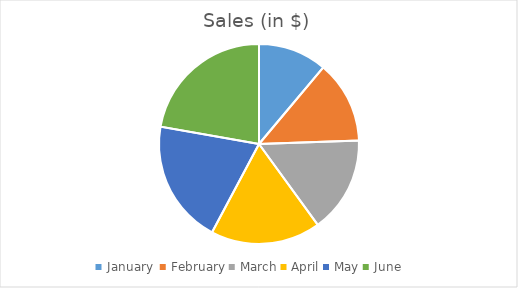
| Category | Sales (in $) |
|---|---|
| January  | 500 |
| February | 600 |
| March | 700 |
| April | 800 |
| May | 900 |
| June | 1000 |